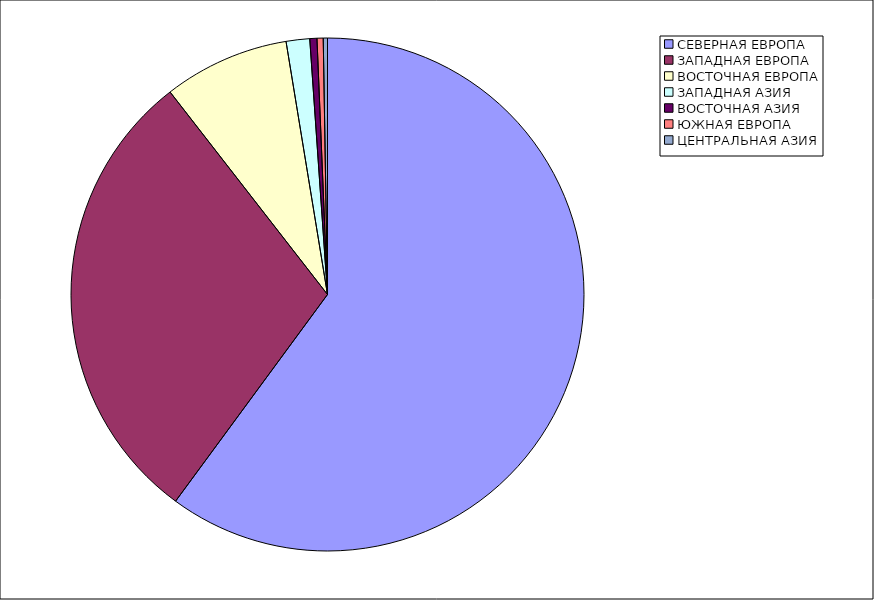
| Category | Оборот |
|---|---|
| СЕВЕРНАЯ ЕВРОПА | 60.088 |
| ЗАПАДНАЯ ЕВРОПА | 29.394 |
| ВОСТОЧНАЯ ЕВРОПА | 7.932 |
| ЗАПАДНАЯ АЗИЯ | 1.482 |
| ВОСТОЧНАЯ АЗИЯ | 0.45 |
| ЮЖНАЯ ЕВРОПА | 0.389 |
| ЦЕНТРАЛЬНАЯ АЗИЯ | 0.265 |